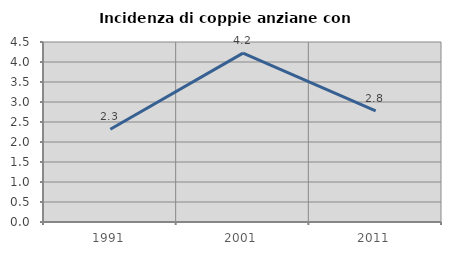
| Category | Incidenza di coppie anziane con figli |
|---|---|
| 1991.0 | 2.317 |
| 2001.0 | 4.222 |
| 2011.0 | 2.778 |